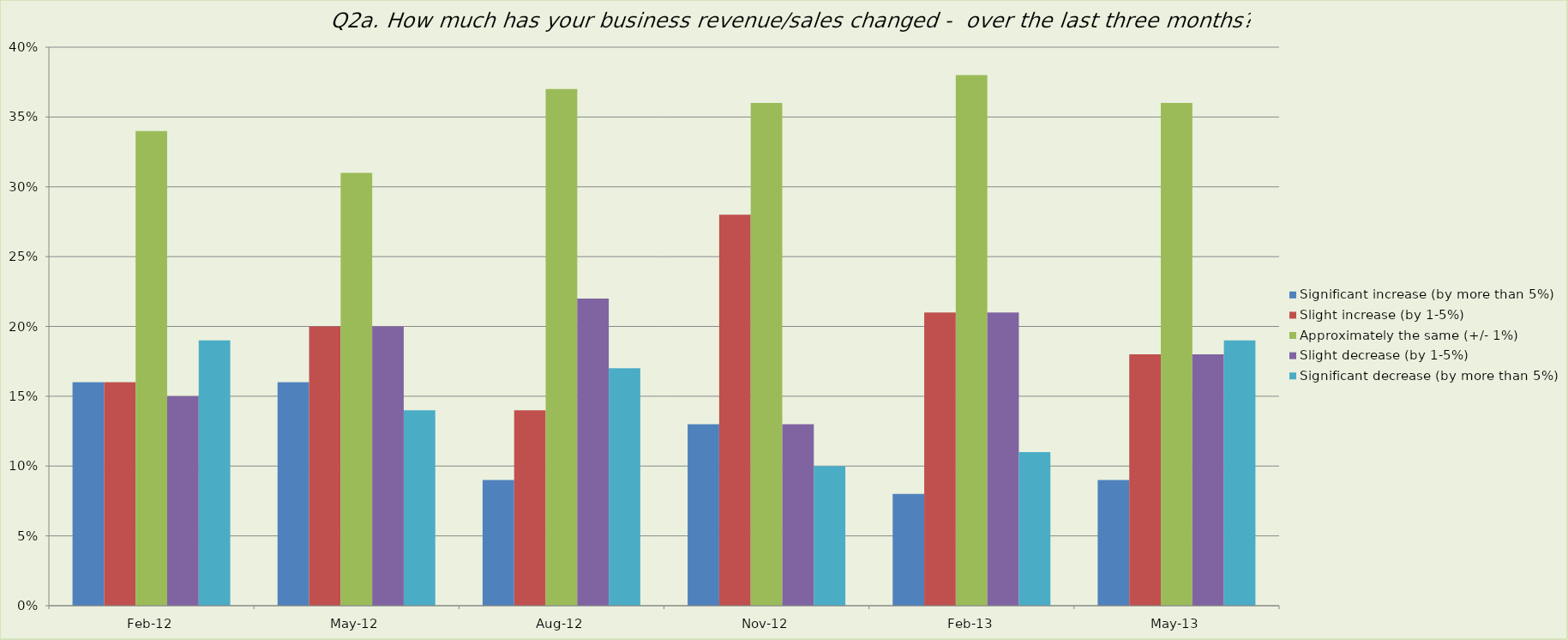
| Category | Significant increase (by more than 5%) | Slight increase (by 1-5%) | Approximately the same (+/- 1%) | Slight decrease (by 1-5%) | Significant decrease (by more than 5%) |
|---|---|---|---|---|---|
| 2012-02-01 | 0.16 | 0.16 | 0.34 | 0.15 | 0.19 |
| 2012-05-01 | 0.16 | 0.2 | 0.31 | 0.2 | 0.14 |
| 2012-08-01 | 0.09 | 0.14 | 0.37 | 0.22 | 0.17 |
| 2012-11-01 | 0.13 | 0.28 | 0.36 | 0.13 | 0.1 |
| 2013-02-01 | 0.08 | 0.21 | 0.38 | 0.21 | 0.11 |
| 2013-05-01 | 0.09 | 0.18 | 0.36 | 0.18 | 0.19 |